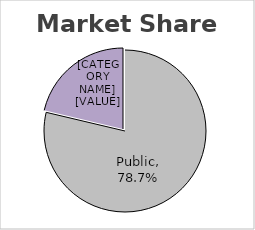
| Category | Amount |
|---|---|
| Public | 0.787 |
| Non Public | 0.213 |